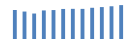
| Category | Exportações (1) |
|---|---|
| 0 | 392293.987 |
| 1 | 370979.678 |
| 2 | 344221.998 |
| 3 | 386156.652 |
| 4 | 390987.572 |
| 5 | 406063.094 |
| 6 | 407598.054 |
| 7 | 406953.169 |
| 8 | 421887.391 |
| 9 | 431264.801 |
| 10 | 442364.452 |
| 11 | 457902.507 |